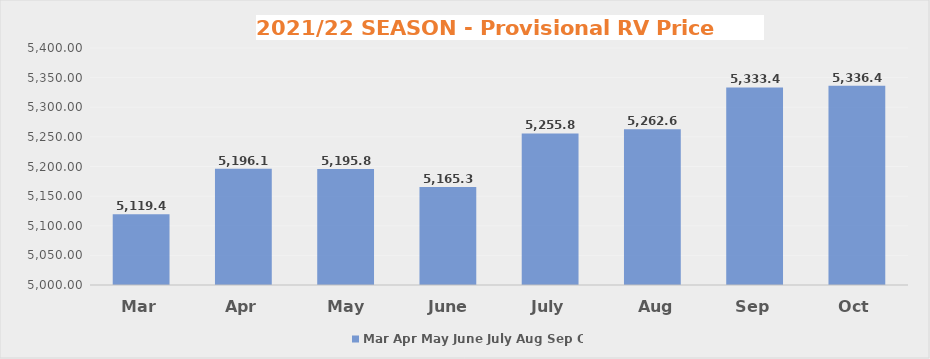
| Category | Mar |
|---|---|
| Mar | 5119.45 |
| Apr | 5196.13 |
| May | 5195.85 |
| June | 5165.31 |
| July | 5255.86 |
| Aug | 5262.66 |
| Sep | 5333.46 |
| Oct | 5336.48 |